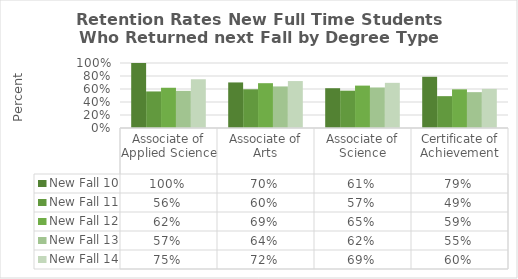
| Category | New Fall 10 | New Fall 11 | New Fall 12 | New Fall 13 | New Fall 14 |
|---|---|---|---|---|---|
| Associate of Applied Science | 1 | 0.562 | 0.619 | 0.571 | 0.75 |
| Associate of Arts | 0.701 | 0.596 | 0.689 | 0.64 | 0.722 |
| Associate of Science | 0.612 | 0.574 | 0.652 | 0.624 | 0.695 |
| Certificate of Achievement | 0.788 | 0.49 | 0.595 | 0.552 | 0.602 |